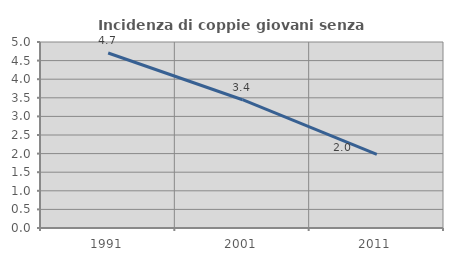
| Category | Incidenza di coppie giovani senza figli |
|---|---|
| 1991.0 | 4.703 |
| 2001.0 | 3.448 |
| 2011.0 | 1.979 |